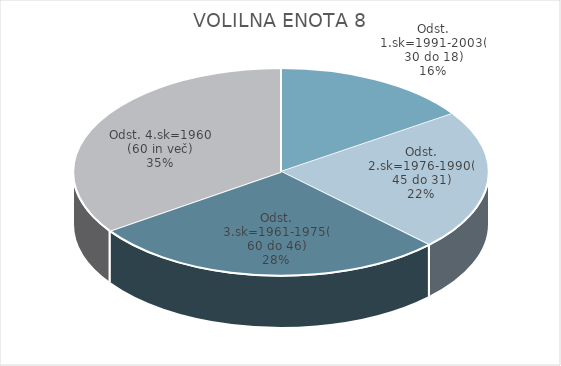
| Category | VOLILNA ENOTA 8 |
|---|---|
| Odst. 1.sk=1991-2003(30 do 18) | 5.77 |
| Odst. 2.sk=1976-1990(45 do 31) | 8.14 |
| Odst. 3.sk=1961-1975(60 do 46) | 10.4 |
| Odst. 4.sk=1960 (60 in več) | 12.87 |